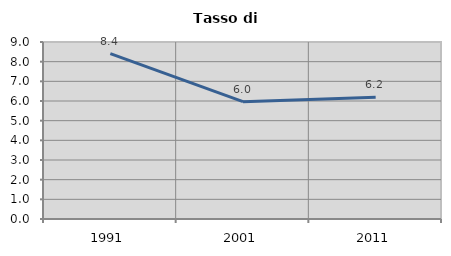
| Category | Tasso di disoccupazione   |
|---|---|
| 1991.0 | 8.409 |
| 2001.0 | 5.968 |
| 2011.0 | 6.186 |